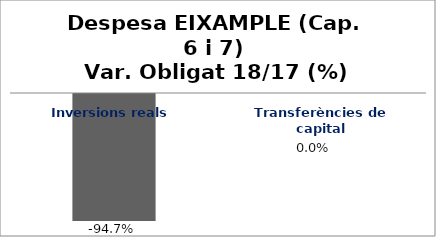
| Category | Series 0 |
|---|---|
| Inversions reals | -0.947 |
| Transferències de capital | 0 |